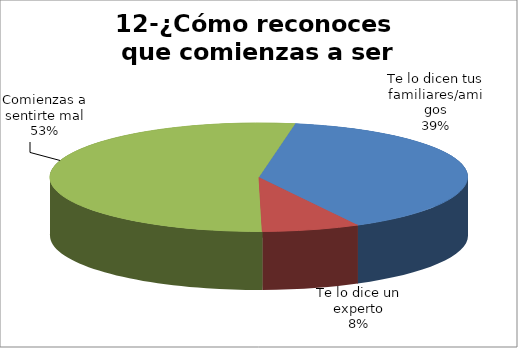
| Category | Series 0 |
|---|---|
| Te lo dicen tus familiares/amigos | 130 |
| Te lo dice un experto | 25 |
| Comienzas a sentirte mal | 175 |